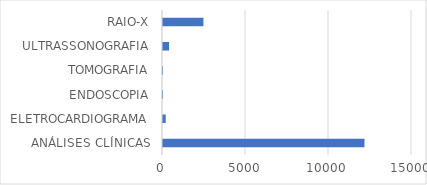
| Category | Series 0 |
|---|---|
| ANÁLISES CLÍNICAS | 12137 |
| ELETROCARDIOGRAMA | 163 |
| ENDOSCOPIA | 1 |
| TOMOGRAFIA | 1 |
| ULTRASSONOGRAFIA | 364 |
| RAIO-X | 2436 |